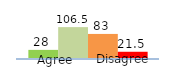
| Category | Series 0 | Series 1 | Series 2 | Series 3 |
|---|---|---|---|---|
| 0 | 28 | 106.5 | 83 | 21.5 |